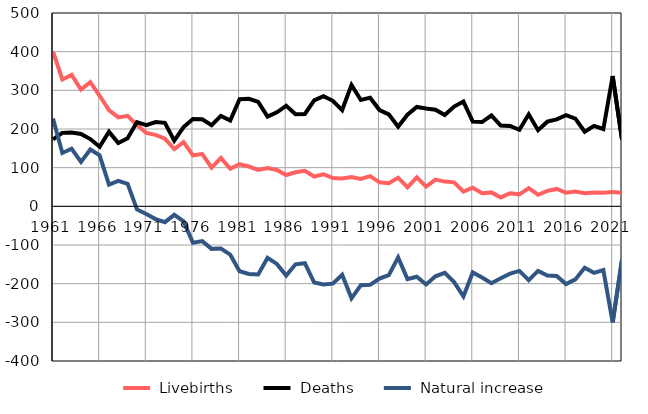
| Category |  Livebirths |  Deaths |  Natural increase |
|---|---|---|---|
| 1961.0 | 400 | 173 | 227 |
| 1962.0 | 328 | 190 | 138 |
| 1963.0 | 340 | 191 | 149 |
| 1964.0 | 302 | 187 | 115 |
| 1965.0 | 321 | 174 | 147 |
| 1966.0 | 286 | 154 | 132 |
| 1967.0 | 249 | 193 | 56 |
| 1968.0 | 230 | 164 | 66 |
| 1969.0 | 234 | 176 | 58 |
| 1970.0 | 210 | 218 | -8 |
| 1971.0 | 190 | 210 | -20 |
| 1972.0 | 185 | 218 | -33 |
| 1973.0 | 175 | 216 | -41 |
| 1974.0 | 148 | 170 | -22 |
| 1975.0 | 166 | 205 | -39 |
| 1976.0 | 132 | 226 | -94 |
| 1977.0 | 135 | 225 | -90 |
| 1978.0 | 100 | 210 | -110 |
| 1979.0 | 125 | 234 | -109 |
| 1980.0 | 97 | 222 | -125 |
| 1981.0 | 109 | 277 | -168 |
| 1982.0 | 103 | 278 | -175 |
| 1983.0 | 94 | 270 | -176 |
| 1984.0 | 99 | 232 | -133 |
| 1985.0 | 94 | 243 | -149 |
| 1986.0 | 81 | 260 | -179 |
| 1987.0 | 88 | 238 | -150 |
| 1988.0 | 92 | 239 | -147 |
| 1989.0 | 77 | 274 | -197 |
| 1990.0 | 83 | 285 | -202 |
| 1991.0 | 73 | 273 | -200 |
| 1992.0 | 72 | 249 | -177 |
| 1993.0 | 76 | 314 | -238 |
| 1994.0 | 71 | 275 | -204 |
| 1995.0 | 78 | 281 | -203 |
| 1996.0 | 62 | 249 | -187 |
| 1997.0 | 60 | 238 | -178 |
| 1998.0 | 74 | 206 | -132 |
| 1999.0 | 49 | 237 | -188 |
| 2000.0 | 75 | 257 | -182 |
| 2001.0 | 51 | 253 | -202 |
| 2002.0 | 69 | 250 | -181 |
| 2003.0 | 64 | 236 | -172 |
| 2004.0 | 62 | 258 | -196 |
| 2005.0 | 38 | 271 | -233 |
| 2006.0 | 48 | 219 | -171 |
| 2007.0 | 34 | 218 | -184 |
| 2008.0 | 36 | 235 | -199 |
| 2009.0 | 23 | 209 | -186 |
| 2010.0 | 34 | 208 | -174 |
| 2011.0 | 31 | 198 | -167 |
| 2012.0 | 47 | 238 | -191 |
| 2013.0 | 30 | 197 | -167 |
| 2014.0 | 40 | 219 | -179 |
| 2015.0 | 45 | 225 | -180 |
| 2016.0 | 35 | 236 | -201 |
| 2017.0 | 38 | 227 | -189 |
| 2018.0 | 34 | 193 | -159 |
| 2019.0 | 36 | 208 | -172 |
| 2020.0 | 35 | 200 | -165 |
| 2021.0 | 37 | 337 | -300 |
| 2022.0 | 35 | 173 | -138 |